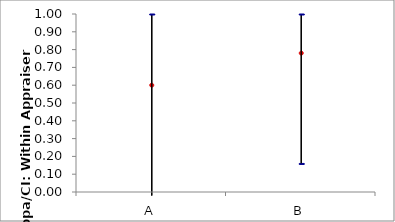
| Category | Fleiss' Kappa | Fleiss' Kappa 95.0% LC | Fleiss' Kappa  95.0% UC |
|---|---|---|---|
| A | 0.6 | -0.02 | 1 |
| B | 0.78 | 0.16 | 1 |